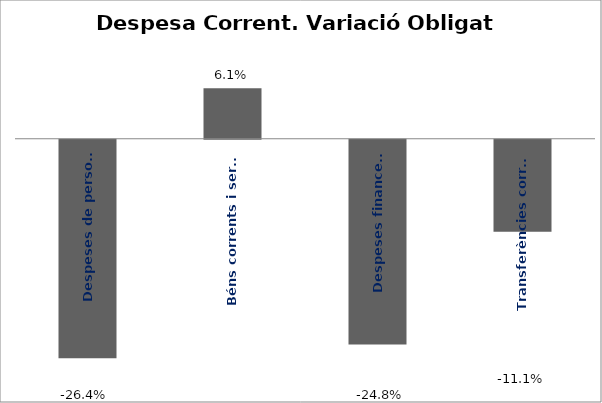
| Category | Series 0 |
|---|---|
| Despeses de personal | -0.264 |
| Béns corrents i serveis | 0.061 |
| Despeses financeres | -0.248 |
| Transferències corrents | -0.111 |